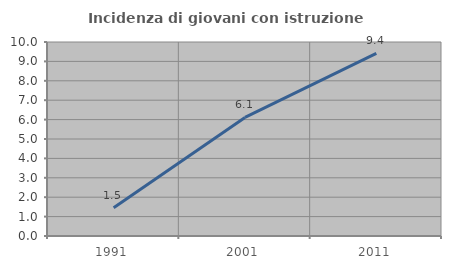
| Category | Incidenza di giovani con istruzione universitaria |
|---|---|
| 1991.0 | 1.46 |
| 2001.0 | 6.111 |
| 2011.0 | 9.412 |